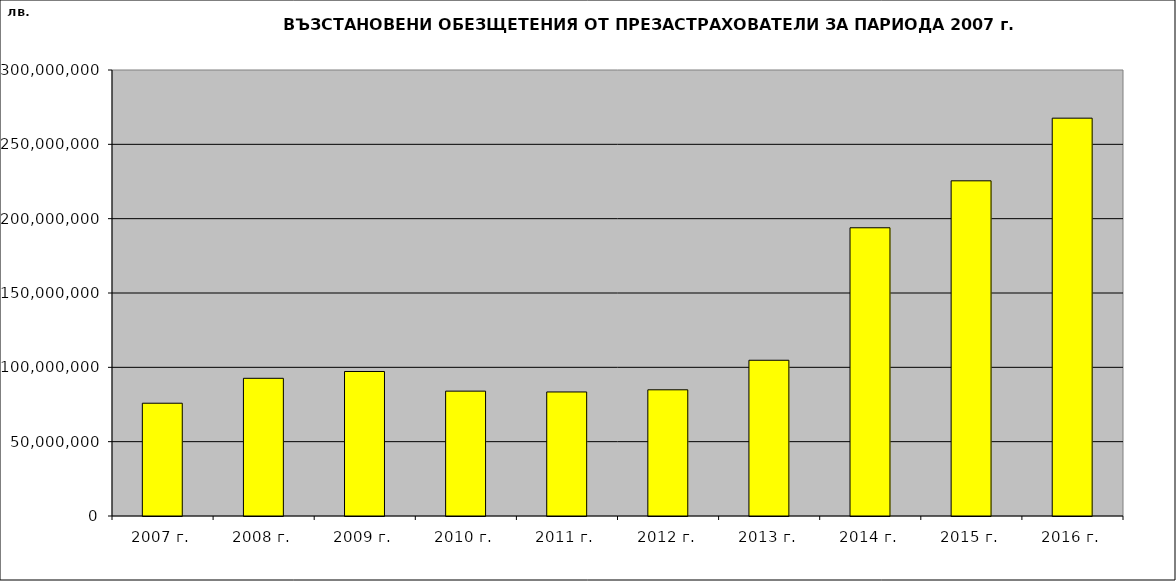
| Category | Възстановени обезщетения от презастрахователи по класове застраховки за периода 2007 г. - 2016 г. |
|---|---|
| 2007 г. | 75861753.531 |
| 2008 г. | 92618851.945 |
| 2009 г. | 97201488.723 |
| 2010 г. | 83991914.008 |
| 2011 г. | 83436121.79 |
| 2012 г. | 84879991.412 |
| 2013 г. | 104754870.79 |
| 2014 г. | 193869580.188 |
| 2015 г. | 225460313.7 |
| 2016 г. | 267607430.706 |